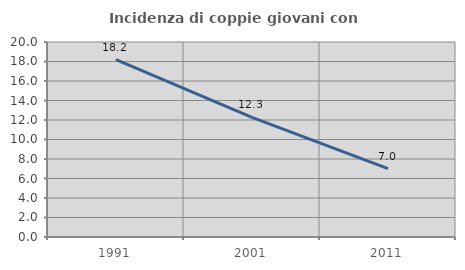
| Category | Incidenza di coppie giovani con figli |
|---|---|
| 1991.0 | 18.195 |
| 2001.0 | 12.26 |
| 2011.0 | 7.004 |